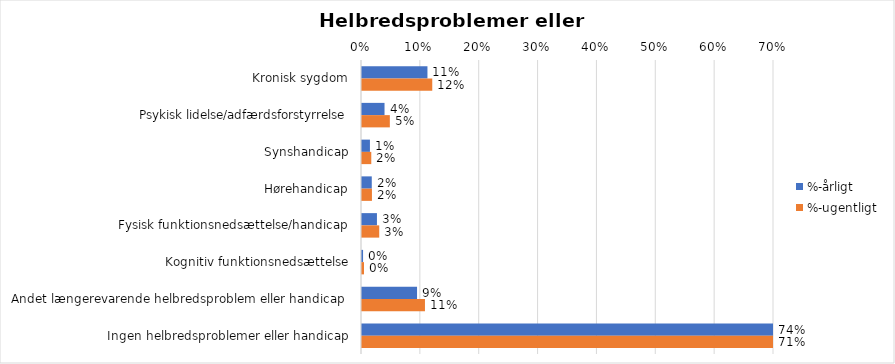
| Category | %-årligt | %-ugentligt |
|---|---|---|
| Kronisk sygdom | 0.111 | 0.119 |
| Psykisk lidelse/adfærdsforstyrrelse | 0.038 | 0.047 |
| Synshandicap | 0.013 | 0.016 |
| Hørehandicap | 0.017 | 0.017 |
| Fysisk funktionsnedsættelse/handicap | 0.025 | 0.029 |
| Kognitiv funktionsnedsættelse | 0.002 | 0.003 |
| Andet længerevarende helbredsproblem eller handicap  | 0.094 | 0.107 |
| Ingen helbredsproblemer eller handicap | 0.741 | 0.709 |